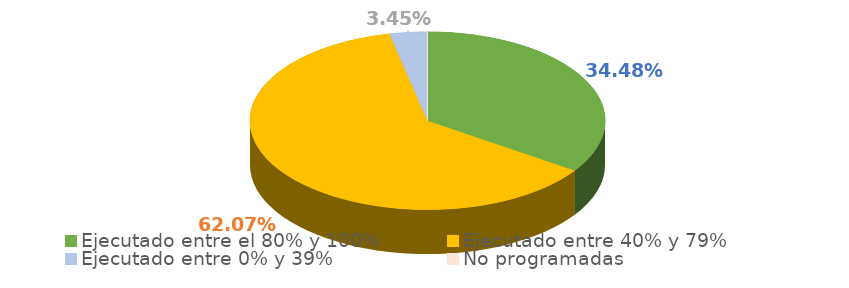
| Category | Series 0 |
|---|---|
| Ejecutado entre el 80% y 100% | 0.345 |
| Ejecutado entre 40% y 79% | 0.621 |
| Ejecutado entre 0% y 39% | 0.034 |
| No programadas | 0 |